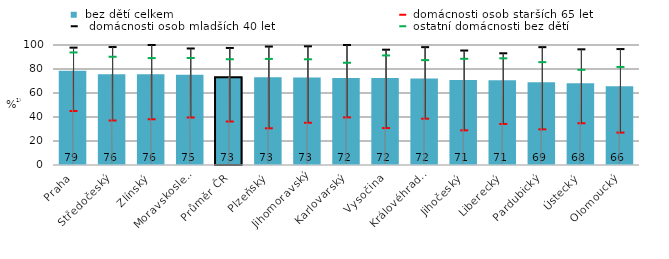
| Category |  bez dětí celkem |
|---|---|
|   Praha | 78.5 |
|   Středočeský | 75.6 |
|   Zlínský | 75.6 |
|   Moravskoslezský | 75.2 |
| Průměr ČR | 73.2 |
|   Plzeňský | 73.2 |
|   Jihomoravský | 73 |
|   Karlovarský | 72.4 |
|   Vysočina | 72.4 |
|   Královéhradecký | 72 |
|   Jihočeský | 70.8 |
|   Liberecký | 70.7 |
|   Pardubický | 69 |
|   Ústecký | 68.2 |
|   Olomoucký | 65.7 |